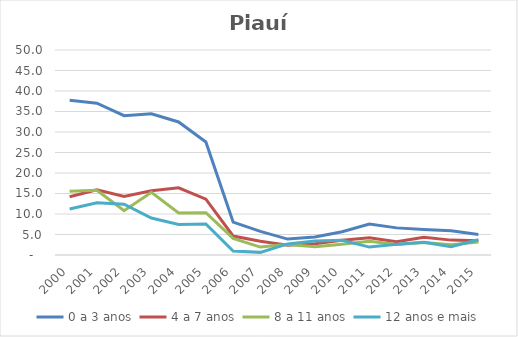
| Category | 0 a 3 anos | 4 a 7 anos | 8 a 11 anos | 12 anos e mais |
|---|---|---|---|---|
| 2000.0 | 37.763 | 14.197 | 15.574 | 11.2 |
| 2001.0 | 37.019 | 15.875 | 15.805 | 12.717 |
| 2002.0 | 33.985 | 14.286 | 10.802 | 12.381 |
| 2003.0 | 34.431 | 15.663 | 15.291 | 9.005 |
| 2004.0 | 32.446 | 16.373 | 10.238 | 7.438 |
| 2005.0 | 27.554 | 13.619 | 10.319 | 7.576 |
| 2006.0 | 8.029 | 4.631 | 4.061 | 0.971 |
| 2007.0 | 5.754 | 3.348 | 1.937 | 0.641 |
| 2008.0 | 3.881 | 2.375 | 2.532 | 2.711 |
| 2009.0 | 4.399 | 2.772 | 1.993 | 3.394 |
| 2010.0 | 5.671 | 3.607 | 2.6 | 3.597 |
| 2011.0 | 7.557 | 4.187 | 3.339 | 1.929 |
| 2012.0 | 6.616 | 3.262 | 2.566 | 2.625 |
| 2013.0 | 6.202 | 4.314 | 3.03 | 3.116 |
| 2014.0 | 5.909 | 3.629 | 2.507 | 2.046 |
| 2015.0 | 4.99 | 3.491 | 3.144 | 3.734 |